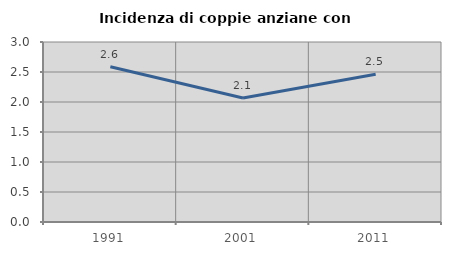
| Category | Incidenza di coppie anziane con figli |
|---|---|
| 1991.0 | 2.586 |
| 2001.0 | 2.068 |
| 2011.0 | 2.463 |